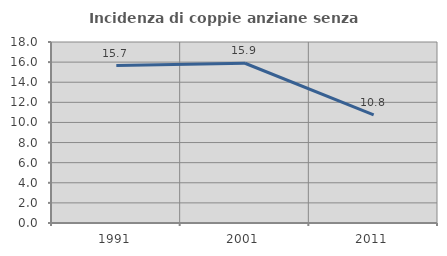
| Category | Incidenza di coppie anziane senza figli  |
|---|---|
| 1991.0 | 15.652 |
| 2001.0 | 15.888 |
| 2011.0 | 10.753 |